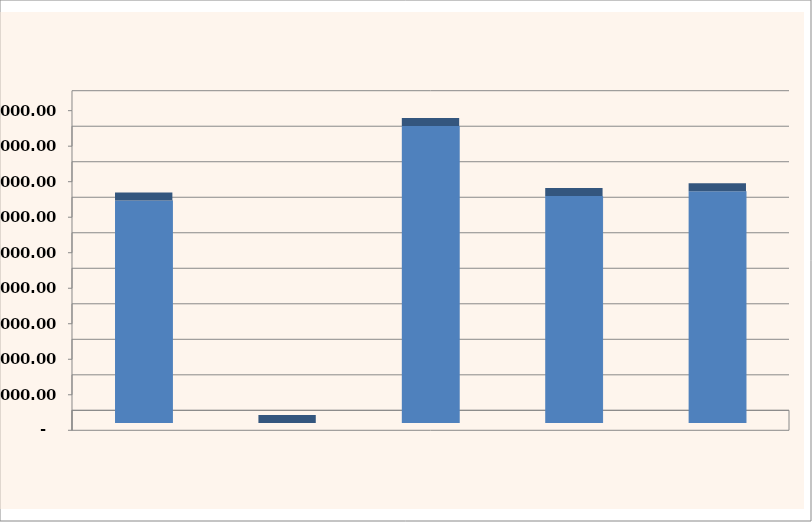
| Category | Series 0 |
|---|---|
| 0 | 6266.495 |
| 1 | 0 |
| 2 | 8359.874 |
| 3 | 6389.109 |
| 4 | 6526.867 |